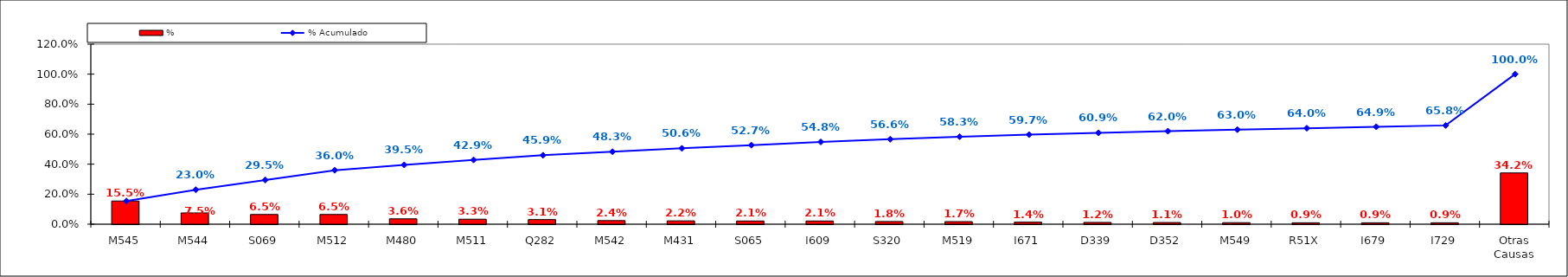
| Category | % |
|---|---|
| M545 | 0.155 |
| M544 | 0.075 |
| S069 | 0.065 |
| M512 | 0.065 |
| M480 | 0.036 |
| M511 | 0.033 |
| Q282 | 0.031 |
| M542 | 0.024 |
| M431 | 0.022 |
| S065 | 0.021 |
| I609 | 0.021 |
| S320 | 0.018 |
| M519 | 0.017 |
| I671 | 0.014 |
| D339 | 0.012 |
| D352 | 0.011 |
| M549 | 0.01 |
| R51X | 0.009 |
| I679 | 0.009 |
| I729 | 0.009 |
| Otras Causas | 0.342 |